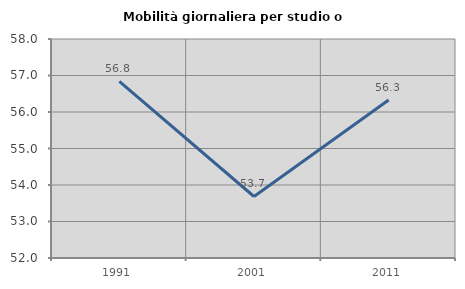
| Category | Mobilità giornaliera per studio o lavoro |
|---|---|
| 1991.0 | 56.838 |
| 2001.0 | 53.685 |
| 2011.0 | 56.33 |